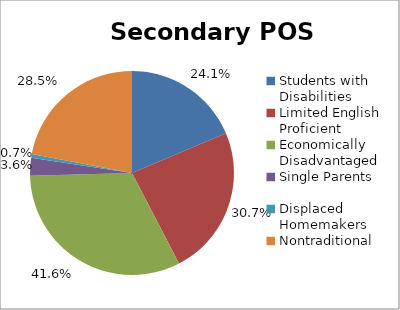
| Category | Series 0 |
|---|---|
| Students with Disabilities | 0.241 |
| Limited English Proficient | 0.307 |
| Economically Disadvantaged | 0.416 |
| Single Parents | 0.036 |
| Displaced Homemakers | 0.007 |
| Nontraditional | 0.285 |